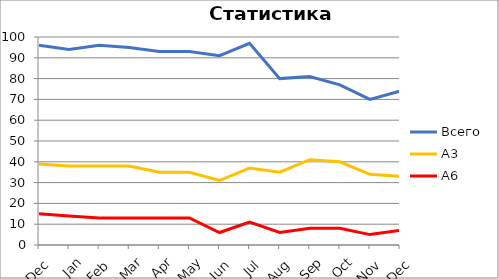
| Category | Всего | А3 | A6 |
|---|---|---|---|
| 0 | 96 | 39 | 15 |
| 1 | 94 | 38 | 14 |
| 2 | 96 | 38 | 13 |
| 3 | 95 | 38 | 13 |
| 4 | 93 | 35 | 13 |
| 5 | 93 | 35 | 13 |
| 6 | 91 | 31 | 6 |
| 7 | 97 | 37 | 11 |
| 8 | 80 | 35 | 6 |
| 9 | 81 | 41 | 8 |
| 10 | 77 | 40 | 8 |
| 11 | 70 | 34 | 5 |
| 12 | 74 | 33 | 7 |